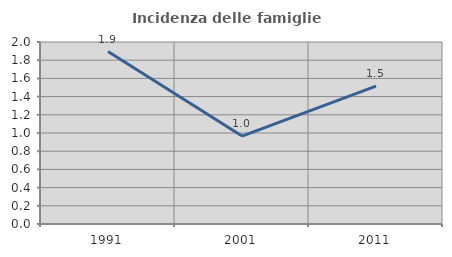
| Category | Incidenza delle famiglie numerose |
|---|---|
| 1991.0 | 1.895 |
| 2001.0 | 0.967 |
| 2011.0 | 1.515 |